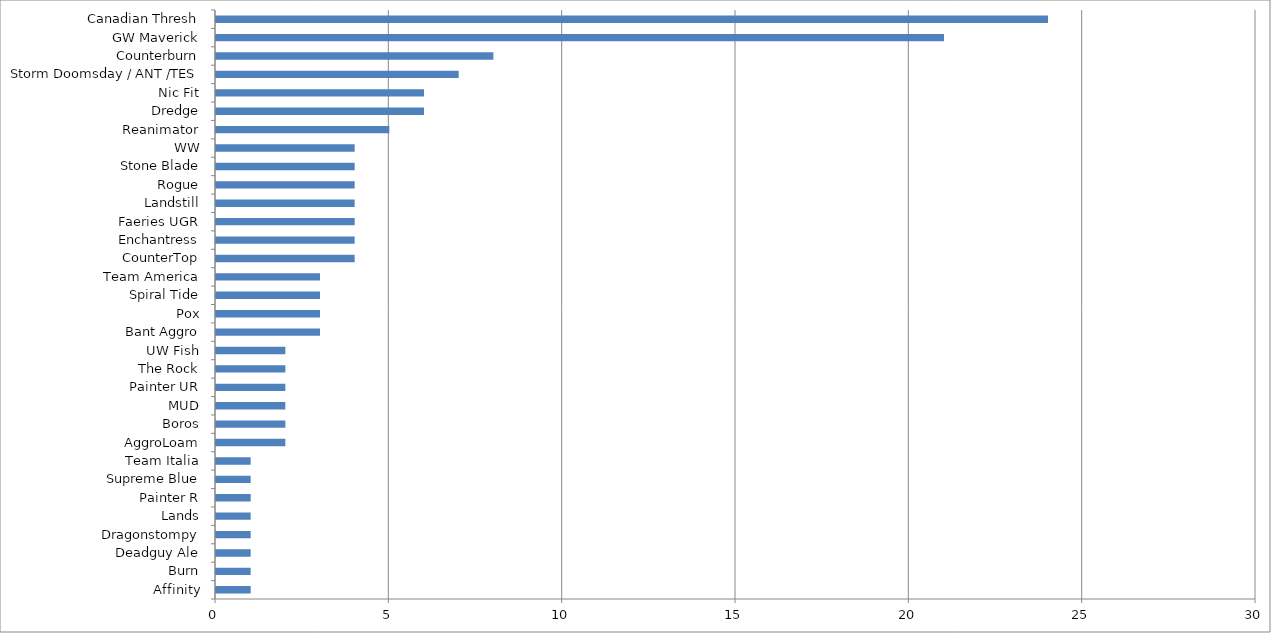
| Category | Series 0 |
|---|---|
| Affinity | 1 |
| Burn | 1 |
| Deadguy Ale | 1 |
| Dragonstompy | 1 |
| Lands | 1 |
| Painter R | 1 |
| Supreme Blue | 1 |
| Team Italia | 1 |
| AggroLoam | 2 |
| Boros | 2 |
| MUD | 2 |
| Painter UR | 2 |
| The Rock | 2 |
| UW Fish | 2 |
| Bant Aggro | 3 |
| Pox | 3 |
| Spiral Tide | 3 |
| Team America | 3 |
| CounterTop | 4 |
| Enchantress | 4 |
| Faeries UGR | 4 |
| Landstill | 4 |
| Rogue | 4 |
| Stone Blade | 4 |
| WW | 4 |
| Reanimator | 5 |
| Dredge | 6 |
| Nic Fit | 6 |
| Storm Doomsday / ANT /TES | 7 |
| Counterburn | 8 |
| GW Maverick | 21 |
| Canadian Thresh | 24 |